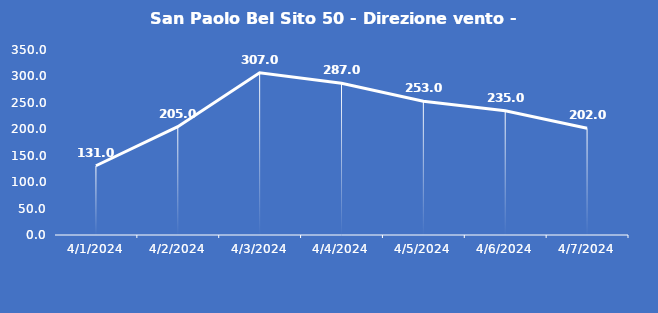
| Category | San Paolo Bel Sito 50 - Direzione vento - Grezzo (°N) |
|---|---|
| 4/1/24 | 131 |
| 4/2/24 | 205 |
| 4/3/24 | 307 |
| 4/4/24 | 287 |
| 4/5/24 | 253 |
| 4/6/24 | 235 |
| 4/7/24 | 202 |